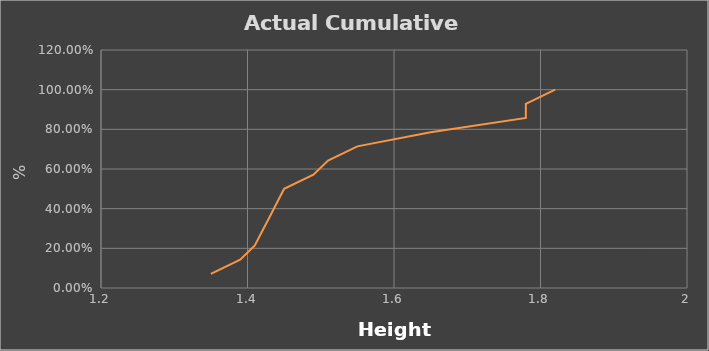
| Category | Actual Cumulative Frequency % |
|---|---|
| 1.35 | 0.071 |
| 1.39 | 0.143 |
| 1.41 | 0.214 |
| 1.42 | 0.286 |
| 1.43 | 0.357 |
| 1.44 | 0.429 |
| 1.45 | 0.5 |
| 1.49 | 0.571 |
| 1.51 | 0.643 |
| 1.55 | 0.714 |
| 1.65 | 0.786 |
| 1.78 | 0.857 |
| 1.78 | 0.929 |
| 1.82 | 1 |